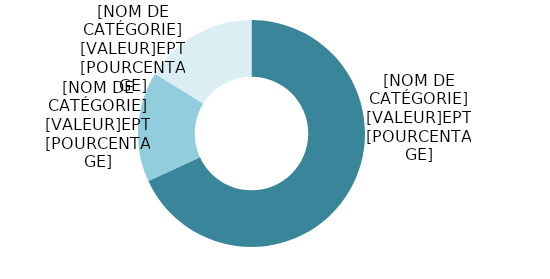
| Category | Series 0 |
|---|---|
| DIP | 3236.637 |
| FNS | 745.762 |
| Autres fonds | 767.835 |